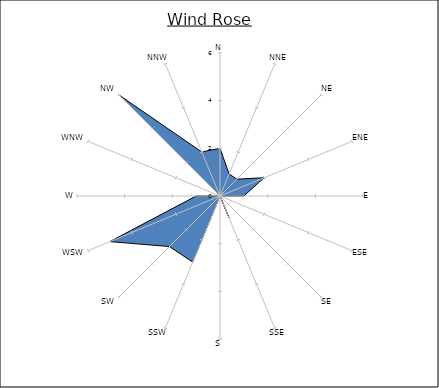
| Category | Series 0 |
|---|---|
| N | 2 |
| NNE | 1 |
| NE | 1 |
| ENE | 2 |
| E | 1 |
| ESE | 0 |
| SE | 0 |
| SSE | 1 |
| S | 0 |
| SSW | 3 |
| SW | 3 |
| WSW | 5 |
| W | 1 |
| WNW | 0 |
| NW | 6 |
| NNW | 2 |